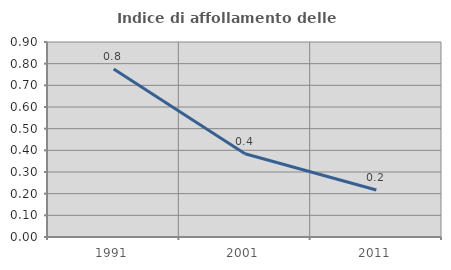
| Category | Indice di affollamento delle abitazioni  |
|---|---|
| 1991.0 | 0.775 |
| 2001.0 | 0.384 |
| 2011.0 | 0.217 |